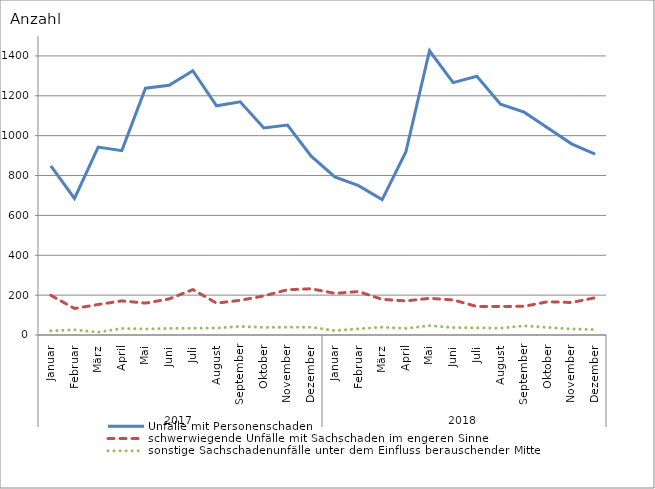
| Category | Unfälle mit Personenschaden | schwerwiegende Unfälle mit Sachschaden im engeren Sinne | sonstige Sachschadenunfälle unter dem Einfluss berauschender Mittel |
|---|---|---|---|
| 0 | 849 | 199 | 21 |
| 1 | 685 | 133 | 26 |
| 2 | 943 | 153 | 14 |
| 3 | 925 | 171 | 33 |
| 4 | 1238 | 160 | 30 |
| 5 | 1253 | 181 | 33 |
| 6 | 1326 | 228 | 34 |
| 7 | 1150 | 160 | 35 |
| 8 | 1170 | 174 | 43 |
| 9 | 1039 | 196 | 38 |
| 10 | 1053 | 227 | 39 |
| 11 | 897 | 232 | 39 |
| 12 | 793 | 209 | 22 |
| 13 | 749 | 218 | 31 |
| 14 | 679 | 179 | 39 |
| 15 | 918 | 171 | 33 |
| 16 | 1426 | 184 | 47 |
| 17 | 1266 | 176 | 37 |
| 18 | 1298 | 143 | 36 |
| 19 | 1158 | 143 | 34 |
| 20 | 1118 | 144 | 46 |
| 21 | 1039 | 167 | 38 |
| 22 | 959 | 163 | 30 |
| 23 | 908 | 187 | 27 |